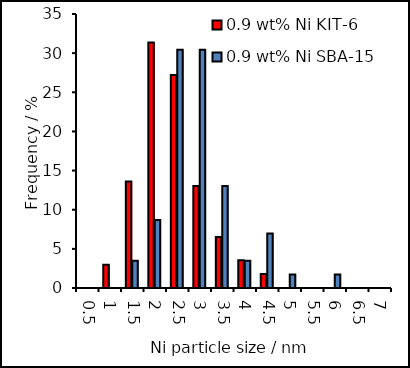
| Category | 0.9 wt% Ni KIT-6 | 0.9 wt% Ni SBA-15 |
|---|---|---|
| 0.5 | 0 | 0 |
| 1.0 | 2.959 | 0 |
| 1.5 | 13.609 | 3.478 |
| 2.0 | 31.361 | 8.696 |
| 2.5 | 27.219 | 30.435 |
| 3.0 | 13.018 | 30.435 |
| 3.5 | 6.509 | 13.043 |
| 4.0 | 3.55 | 3.478 |
| 4.5 | 1.775 | 6.957 |
| 5.0 | 0 | 1.739 |
| 5.5 | 0 | 0 |
| 6.0 | 0 | 1.739 |
| 6.5 | 0 | 0 |
| 7.0 | 0 | 0 |